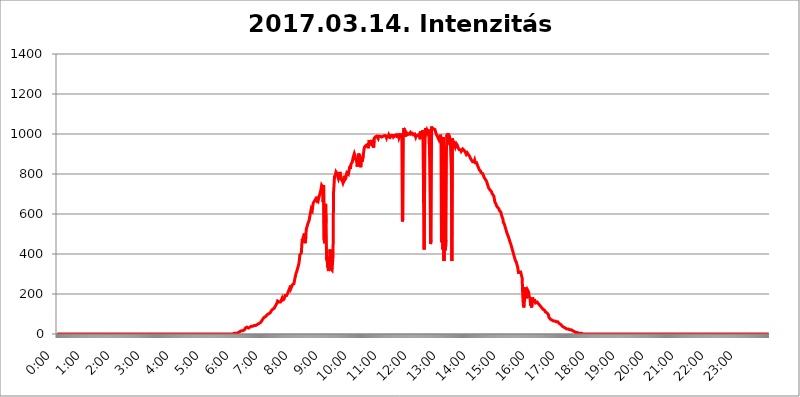
| Category | 2017.03.14. Intenzitás [W/m^2] |
|---|---|
| 0.0 | 0 |
| 0.0006944444444444445 | 0 |
| 0.001388888888888889 | 0 |
| 0.0020833333333333333 | 0 |
| 0.002777777777777778 | 0 |
| 0.003472222222222222 | 0 |
| 0.004166666666666667 | 0 |
| 0.004861111111111111 | 0 |
| 0.005555555555555556 | 0 |
| 0.0062499999999999995 | 0 |
| 0.006944444444444444 | 0 |
| 0.007638888888888889 | 0 |
| 0.008333333333333333 | 0 |
| 0.009027777777777779 | 0 |
| 0.009722222222222222 | 0 |
| 0.010416666666666666 | 0 |
| 0.011111111111111112 | 0 |
| 0.011805555555555555 | 0 |
| 0.012499999999999999 | 0 |
| 0.013194444444444444 | 0 |
| 0.013888888888888888 | 0 |
| 0.014583333333333332 | 0 |
| 0.015277777777777777 | 0 |
| 0.015972222222222224 | 0 |
| 0.016666666666666666 | 0 |
| 0.017361111111111112 | 0 |
| 0.018055555555555557 | 0 |
| 0.01875 | 0 |
| 0.019444444444444445 | 0 |
| 0.02013888888888889 | 0 |
| 0.020833333333333332 | 0 |
| 0.02152777777777778 | 0 |
| 0.022222222222222223 | 0 |
| 0.02291666666666667 | 0 |
| 0.02361111111111111 | 0 |
| 0.024305555555555556 | 0 |
| 0.024999999999999998 | 0 |
| 0.025694444444444447 | 0 |
| 0.02638888888888889 | 0 |
| 0.027083333333333334 | 0 |
| 0.027777777777777776 | 0 |
| 0.02847222222222222 | 0 |
| 0.029166666666666664 | 0 |
| 0.029861111111111113 | 0 |
| 0.030555555555555555 | 0 |
| 0.03125 | 0 |
| 0.03194444444444445 | 0 |
| 0.03263888888888889 | 0 |
| 0.03333333333333333 | 0 |
| 0.034027777777777775 | 0 |
| 0.034722222222222224 | 0 |
| 0.035416666666666666 | 0 |
| 0.036111111111111115 | 0 |
| 0.03680555555555556 | 0 |
| 0.0375 | 0 |
| 0.03819444444444444 | 0 |
| 0.03888888888888889 | 0 |
| 0.03958333333333333 | 0 |
| 0.04027777777777778 | 0 |
| 0.04097222222222222 | 0 |
| 0.041666666666666664 | 0 |
| 0.042361111111111106 | 0 |
| 0.04305555555555556 | 0 |
| 0.043750000000000004 | 0 |
| 0.044444444444444446 | 0 |
| 0.04513888888888889 | 0 |
| 0.04583333333333334 | 0 |
| 0.04652777777777778 | 0 |
| 0.04722222222222222 | 0 |
| 0.04791666666666666 | 0 |
| 0.04861111111111111 | 0 |
| 0.049305555555555554 | 0 |
| 0.049999999999999996 | 0 |
| 0.05069444444444445 | 0 |
| 0.051388888888888894 | 0 |
| 0.052083333333333336 | 0 |
| 0.05277777777777778 | 0 |
| 0.05347222222222222 | 0 |
| 0.05416666666666667 | 0 |
| 0.05486111111111111 | 0 |
| 0.05555555555555555 | 0 |
| 0.05625 | 0 |
| 0.05694444444444444 | 0 |
| 0.057638888888888885 | 0 |
| 0.05833333333333333 | 0 |
| 0.05902777777777778 | 0 |
| 0.059722222222222225 | 0 |
| 0.06041666666666667 | 0 |
| 0.061111111111111116 | 0 |
| 0.06180555555555556 | 0 |
| 0.0625 | 0 |
| 0.06319444444444444 | 0 |
| 0.06388888888888888 | 0 |
| 0.06458333333333334 | 0 |
| 0.06527777777777778 | 0 |
| 0.06597222222222222 | 0 |
| 0.06666666666666667 | 0 |
| 0.06736111111111111 | 0 |
| 0.06805555555555555 | 0 |
| 0.06874999999999999 | 0 |
| 0.06944444444444443 | 0 |
| 0.07013888888888889 | 0 |
| 0.07083333333333333 | 0 |
| 0.07152777777777779 | 0 |
| 0.07222222222222223 | 0 |
| 0.07291666666666667 | 0 |
| 0.07361111111111111 | 0 |
| 0.07430555555555556 | 0 |
| 0.075 | 0 |
| 0.07569444444444444 | 0 |
| 0.0763888888888889 | 0 |
| 0.07708333333333334 | 0 |
| 0.07777777777777778 | 0 |
| 0.07847222222222222 | 0 |
| 0.07916666666666666 | 0 |
| 0.0798611111111111 | 0 |
| 0.08055555555555556 | 0 |
| 0.08125 | 0 |
| 0.08194444444444444 | 0 |
| 0.08263888888888889 | 0 |
| 0.08333333333333333 | 0 |
| 0.08402777777777777 | 0 |
| 0.08472222222222221 | 0 |
| 0.08541666666666665 | 0 |
| 0.08611111111111112 | 0 |
| 0.08680555555555557 | 0 |
| 0.08750000000000001 | 0 |
| 0.08819444444444445 | 0 |
| 0.08888888888888889 | 0 |
| 0.08958333333333333 | 0 |
| 0.09027777777777778 | 0 |
| 0.09097222222222222 | 0 |
| 0.09166666666666667 | 0 |
| 0.09236111111111112 | 0 |
| 0.09305555555555556 | 0 |
| 0.09375 | 0 |
| 0.09444444444444444 | 0 |
| 0.09513888888888888 | 0 |
| 0.09583333333333333 | 0 |
| 0.09652777777777777 | 0 |
| 0.09722222222222222 | 0 |
| 0.09791666666666667 | 0 |
| 0.09861111111111111 | 0 |
| 0.09930555555555555 | 0 |
| 0.09999999999999999 | 0 |
| 0.10069444444444443 | 0 |
| 0.1013888888888889 | 0 |
| 0.10208333333333335 | 0 |
| 0.10277777777777779 | 0 |
| 0.10347222222222223 | 0 |
| 0.10416666666666667 | 0 |
| 0.10486111111111111 | 0 |
| 0.10555555555555556 | 0 |
| 0.10625 | 0 |
| 0.10694444444444444 | 0 |
| 0.1076388888888889 | 0 |
| 0.10833333333333334 | 0 |
| 0.10902777777777778 | 0 |
| 0.10972222222222222 | 0 |
| 0.1111111111111111 | 0 |
| 0.11180555555555556 | 0 |
| 0.11180555555555556 | 0 |
| 0.1125 | 0 |
| 0.11319444444444444 | 0 |
| 0.11388888888888889 | 0 |
| 0.11458333333333333 | 0 |
| 0.11527777777777777 | 0 |
| 0.11597222222222221 | 0 |
| 0.11666666666666665 | 0 |
| 0.1173611111111111 | 0 |
| 0.11805555555555557 | 0 |
| 0.11944444444444445 | 0 |
| 0.12013888888888889 | 0 |
| 0.12083333333333333 | 0 |
| 0.12152777777777778 | 0 |
| 0.12222222222222223 | 0 |
| 0.12291666666666667 | 0 |
| 0.12291666666666667 | 0 |
| 0.12361111111111112 | 0 |
| 0.12430555555555556 | 0 |
| 0.125 | 0 |
| 0.12569444444444444 | 0 |
| 0.12638888888888888 | 0 |
| 0.12708333333333333 | 0 |
| 0.16875 | 0 |
| 0.12847222222222224 | 0 |
| 0.12916666666666668 | 0 |
| 0.12986111111111112 | 0 |
| 0.13055555555555556 | 0 |
| 0.13125 | 0 |
| 0.13194444444444445 | 0 |
| 0.1326388888888889 | 0 |
| 0.13333333333333333 | 0 |
| 0.13402777777777777 | 0 |
| 0.13402777777777777 | 0 |
| 0.13472222222222222 | 0 |
| 0.13541666666666666 | 0 |
| 0.1361111111111111 | 0 |
| 0.13749999999999998 | 0 |
| 0.13819444444444443 | 0 |
| 0.1388888888888889 | 0 |
| 0.13958333333333334 | 0 |
| 0.14027777777777778 | 0 |
| 0.14097222222222222 | 0 |
| 0.14166666666666666 | 0 |
| 0.1423611111111111 | 0 |
| 0.14305555555555557 | 0 |
| 0.14375000000000002 | 0 |
| 0.14444444444444446 | 0 |
| 0.1451388888888889 | 0 |
| 0.1451388888888889 | 0 |
| 0.14652777777777778 | 0 |
| 0.14722222222222223 | 0 |
| 0.14791666666666667 | 0 |
| 0.1486111111111111 | 0 |
| 0.14930555555555555 | 0 |
| 0.15 | 0 |
| 0.15069444444444444 | 0 |
| 0.15138888888888888 | 0 |
| 0.15208333333333332 | 0 |
| 0.15277777777777776 | 0 |
| 0.15347222222222223 | 0 |
| 0.15416666666666667 | 0 |
| 0.15486111111111112 | 0 |
| 0.15555555555555556 | 0 |
| 0.15625 | 0 |
| 0.15694444444444444 | 0 |
| 0.15763888888888888 | 0 |
| 0.15833333333333333 | 0 |
| 0.15902777777777777 | 0 |
| 0.15972222222222224 | 0 |
| 0.16041666666666668 | 0 |
| 0.16111111111111112 | 0 |
| 0.16180555555555556 | 0 |
| 0.1625 | 0 |
| 0.16319444444444445 | 0 |
| 0.1638888888888889 | 0 |
| 0.16458333333333333 | 0 |
| 0.16527777777777777 | 0 |
| 0.16597222222222222 | 0 |
| 0.16666666666666666 | 0 |
| 0.1673611111111111 | 0 |
| 0.16805555555555554 | 0 |
| 0.16874999999999998 | 0 |
| 0.16944444444444443 | 0 |
| 0.17013888888888887 | 0 |
| 0.1708333333333333 | 0 |
| 0.17152777777777775 | 0 |
| 0.17222222222222225 | 0 |
| 0.1729166666666667 | 0 |
| 0.17361111111111113 | 0 |
| 0.17430555555555557 | 0 |
| 0.17500000000000002 | 0 |
| 0.17569444444444446 | 0 |
| 0.1763888888888889 | 0 |
| 0.17708333333333334 | 0 |
| 0.17777777777777778 | 0 |
| 0.17847222222222223 | 0 |
| 0.17916666666666667 | 0 |
| 0.1798611111111111 | 0 |
| 0.18055555555555555 | 0 |
| 0.18125 | 0 |
| 0.18194444444444444 | 0 |
| 0.1826388888888889 | 0 |
| 0.18333333333333335 | 0 |
| 0.1840277777777778 | 0 |
| 0.18472222222222223 | 0 |
| 0.18541666666666667 | 0 |
| 0.18611111111111112 | 0 |
| 0.18680555555555556 | 0 |
| 0.1875 | 0 |
| 0.18819444444444444 | 0 |
| 0.18888888888888888 | 0 |
| 0.18958333333333333 | 0 |
| 0.19027777777777777 | 0 |
| 0.1909722222222222 | 0 |
| 0.19166666666666665 | 0 |
| 0.19236111111111112 | 0 |
| 0.19305555555555554 | 0 |
| 0.19375 | 0 |
| 0.19444444444444445 | 0 |
| 0.1951388888888889 | 0 |
| 0.19583333333333333 | 0 |
| 0.19652777777777777 | 0 |
| 0.19722222222222222 | 0 |
| 0.19791666666666666 | 0 |
| 0.1986111111111111 | 0 |
| 0.19930555555555554 | 0 |
| 0.19999999999999998 | 0 |
| 0.20069444444444443 | 0 |
| 0.20138888888888887 | 0 |
| 0.2020833333333333 | 0 |
| 0.2027777777777778 | 0 |
| 0.2034722222222222 | 0 |
| 0.2041666666666667 | 0 |
| 0.20486111111111113 | 0 |
| 0.20555555555555557 | 0 |
| 0.20625000000000002 | 0 |
| 0.20694444444444446 | 0 |
| 0.2076388888888889 | 0 |
| 0.20833333333333334 | 0 |
| 0.20902777777777778 | 0 |
| 0.20972222222222223 | 0 |
| 0.21041666666666667 | 0 |
| 0.2111111111111111 | 0 |
| 0.21180555555555555 | 0 |
| 0.2125 | 0 |
| 0.21319444444444444 | 0 |
| 0.2138888888888889 | 0 |
| 0.21458333333333335 | 0 |
| 0.2152777777777778 | 0 |
| 0.21597222222222223 | 0 |
| 0.21666666666666667 | 0 |
| 0.21736111111111112 | 0 |
| 0.21805555555555556 | 0 |
| 0.21875 | 0 |
| 0.21944444444444444 | 0 |
| 0.22013888888888888 | 0 |
| 0.22083333333333333 | 0 |
| 0.22152777777777777 | 0 |
| 0.2222222222222222 | 0 |
| 0.22291666666666665 | 0 |
| 0.2236111111111111 | 0 |
| 0.22430555555555556 | 0 |
| 0.225 | 0 |
| 0.22569444444444445 | 0 |
| 0.2263888888888889 | 0 |
| 0.22708333333333333 | 0 |
| 0.22777777777777777 | 0 |
| 0.22847222222222222 | 0 |
| 0.22916666666666666 | 0 |
| 0.2298611111111111 | 0 |
| 0.23055555555555554 | 0 |
| 0.23124999999999998 | 0 |
| 0.23194444444444443 | 0 |
| 0.23263888888888887 | 0 |
| 0.2333333333333333 | 0 |
| 0.2340277777777778 | 0 |
| 0.2347222222222222 | 0 |
| 0.2354166666666667 | 0 |
| 0.23611111111111113 | 0 |
| 0.23680555555555557 | 0 |
| 0.23750000000000002 | 0 |
| 0.23819444444444446 | 0 |
| 0.2388888888888889 | 0 |
| 0.23958333333333334 | 0 |
| 0.24027777777777778 | 0 |
| 0.24097222222222223 | 0 |
| 0.24166666666666667 | 0 |
| 0.2423611111111111 | 0 |
| 0.24305555555555555 | 0 |
| 0.24375 | 0 |
| 0.24444444444444446 | 0 |
| 0.24513888888888888 | 0 |
| 0.24583333333333335 | 0 |
| 0.2465277777777778 | 0 |
| 0.24722222222222223 | 0 |
| 0.24791666666666667 | 3.525 |
| 0.24861111111111112 | 3.525 |
| 0.24930555555555556 | 3.525 |
| 0.25 | 3.525 |
| 0.25069444444444444 | 3.525 |
| 0.2513888888888889 | 3.525 |
| 0.2520833333333333 | 3.525 |
| 0.25277777777777777 | 3.525 |
| 0.2534722222222222 | 3.525 |
| 0.25416666666666665 | 7.887 |
| 0.2548611111111111 | 7.887 |
| 0.2555555555555556 | 7.887 |
| 0.25625000000000003 | 12.257 |
| 0.2569444444444445 | 12.257 |
| 0.2576388888888889 | 12.257 |
| 0.25833333333333336 | 16.636 |
| 0.2590277777777778 | 16.636 |
| 0.25972222222222224 | 16.636 |
| 0.2604166666666667 | 16.636 |
| 0.2611111111111111 | 21.024 |
| 0.26180555555555557 | 21.024 |
| 0.2625 | 21.024 |
| 0.26319444444444445 | 25.419 |
| 0.2638888888888889 | 29.823 |
| 0.26458333333333334 | 29.823 |
| 0.2652777777777778 | 29.823 |
| 0.2659722222222222 | 34.234 |
| 0.26666666666666666 | 29.823 |
| 0.2673611111111111 | 29.823 |
| 0.26805555555555555 | 29.823 |
| 0.26875 | 29.823 |
| 0.26944444444444443 | 29.823 |
| 0.2701388888888889 | 34.234 |
| 0.2708333333333333 | 34.234 |
| 0.27152777777777776 | 38.653 |
| 0.2722222222222222 | 38.653 |
| 0.27291666666666664 | 38.653 |
| 0.2736111111111111 | 38.653 |
| 0.2743055555555555 | 38.653 |
| 0.27499999999999997 | 43.079 |
| 0.27569444444444446 | 43.079 |
| 0.27638888888888885 | 43.079 |
| 0.27708333333333335 | 43.079 |
| 0.2777777777777778 | 43.079 |
| 0.27847222222222223 | 43.079 |
| 0.2791666666666667 | 43.079 |
| 0.2798611111111111 | 47.511 |
| 0.28055555555555556 | 47.511 |
| 0.28125 | 47.511 |
| 0.28194444444444444 | 47.511 |
| 0.2826388888888889 | 51.951 |
| 0.2833333333333333 | 51.951 |
| 0.28402777777777777 | 56.398 |
| 0.2847222222222222 | 56.398 |
| 0.28541666666666665 | 56.398 |
| 0.28611111111111115 | 60.85 |
| 0.28680555555555554 | 65.31 |
| 0.28750000000000003 | 65.31 |
| 0.2881944444444445 | 74.246 |
| 0.2888888888888889 | 74.246 |
| 0.28958333333333336 | 78.722 |
| 0.2902777777777778 | 83.205 |
| 0.29097222222222224 | 87.692 |
| 0.2916666666666667 | 87.692 |
| 0.2923611111111111 | 87.692 |
| 0.29305555555555557 | 92.184 |
| 0.29375 | 92.184 |
| 0.29444444444444445 | 96.682 |
| 0.2951388888888889 | 101.184 |
| 0.29583333333333334 | 101.184 |
| 0.2965277777777778 | 101.184 |
| 0.2972222222222222 | 101.184 |
| 0.29791666666666666 | 101.184 |
| 0.2986111111111111 | 105.69 |
| 0.29930555555555555 | 110.201 |
| 0.3 | 114.716 |
| 0.30069444444444443 | 114.716 |
| 0.3013888888888889 | 119.235 |
| 0.3020833333333333 | 123.758 |
| 0.30277777777777776 | 123.758 |
| 0.3034722222222222 | 128.284 |
| 0.30416666666666664 | 128.284 |
| 0.3048611111111111 | 132.814 |
| 0.3055555555555555 | 137.347 |
| 0.30624999999999997 | 141.884 |
| 0.3069444444444444 | 146.423 |
| 0.3076388888888889 | 150.964 |
| 0.30833333333333335 | 155.509 |
| 0.3090277777777778 | 164.605 |
| 0.30972222222222223 | 164.605 |
| 0.3104166666666667 | 160.056 |
| 0.3111111111111111 | 160.056 |
| 0.31180555555555556 | 160.056 |
| 0.3125 | 160.056 |
| 0.31319444444444444 | 160.056 |
| 0.3138888888888889 | 155.509 |
| 0.3145833333333333 | 164.605 |
| 0.31527777777777777 | 178.264 |
| 0.3159722222222222 | 169.156 |
| 0.31666666666666665 | 169.156 |
| 0.31736111111111115 | 173.709 |
| 0.31805555555555554 | 173.709 |
| 0.31875000000000003 | 182.82 |
| 0.3194444444444445 | 191.937 |
| 0.3201388888888889 | 187.378 |
| 0.32083333333333336 | 187.378 |
| 0.3215277777777778 | 191.937 |
| 0.32222222222222224 | 196.497 |
| 0.3229166666666667 | 201.058 |
| 0.3236111111111111 | 205.62 |
| 0.32430555555555557 | 214.746 |
| 0.325 | 219.309 |
| 0.32569444444444445 | 214.746 |
| 0.3263888888888889 | 233 |
| 0.32708333333333334 | 242.127 |
| 0.3277777777777778 | 228.436 |
| 0.3284722222222222 | 233 |
| 0.32916666666666666 | 233 |
| 0.3298611111111111 | 246.689 |
| 0.33055555555555555 | 251.251 |
| 0.33125 | 251.251 |
| 0.33194444444444443 | 251.251 |
| 0.3326388888888889 | 264.932 |
| 0.3333333333333333 | 278.603 |
| 0.3340277777777778 | 287.709 |
| 0.3347222222222222 | 301.354 |
| 0.3354166666666667 | 296.808 |
| 0.3361111111111111 | 314.98 |
| 0.3368055555555556 | 324.052 |
| 0.33749999999999997 | 333.113 |
| 0.33819444444444446 | 333.113 |
| 0.33888888888888885 | 351.198 |
| 0.33958333333333335 | 369.23 |
| 0.34027777777777773 | 396.164 |
| 0.34097222222222223 | 396.164 |
| 0.3416666666666666 | 396.164 |
| 0.3423611111111111 | 405.108 |
| 0.3430555555555555 | 449.551 |
| 0.34375 | 475.972 |
| 0.3444444444444445 | 458.38 |
| 0.3451388888888889 | 484.735 |
| 0.3458333333333334 | 480.356 |
| 0.34652777777777777 | 502.192 |
| 0.34722222222222227 | 462.786 |
| 0.34791666666666665 | 453.968 |
| 0.34861111111111115 | 489.108 |
| 0.34930555555555554 | 523.88 |
| 0.35000000000000003 | 532.513 |
| 0.3506944444444444 | 528.2 |
| 0.3513888888888889 | 549.704 |
| 0.3520833333333333 | 553.986 |
| 0.3527777777777778 | 549.704 |
| 0.3534722222222222 | 571.049 |
| 0.3541666666666667 | 575.299 |
| 0.3548611111111111 | 600.661 |
| 0.35555555555555557 | 613.252 |
| 0.35625 | 625.784 |
| 0.35694444444444445 | 629.948 |
| 0.3576388888888889 | 617.436 |
| 0.35833333333333334 | 638.256 |
| 0.3590277777777778 | 654.791 |
| 0.3597222222222222 | 654.791 |
| 0.36041666666666666 | 663.019 |
| 0.3611111111111111 | 667.123 |
| 0.36180555555555555 | 663.019 |
| 0.3625 | 675.311 |
| 0.36319444444444443 | 671.22 |
| 0.3638888888888889 | 667.123 |
| 0.3645833333333333 | 675.311 |
| 0.3652777777777778 | 679.395 |
| 0.3659722222222222 | 667.123 |
| 0.3666666666666667 | 679.395 |
| 0.3673611111111111 | 687.544 |
| 0.3680555555555556 | 687.544 |
| 0.36874999999999997 | 687.544 |
| 0.36944444444444446 | 715.858 |
| 0.37013888888888885 | 727.896 |
| 0.37083333333333335 | 743.859 |
| 0.37152777777777773 | 739.877 |
| 0.37222222222222223 | 735.89 |
| 0.3729166666666666 | 658.909 |
| 0.3736111111111111 | 743.859 |
| 0.3743055555555555 | 471.582 |
| 0.375 | 453.968 |
| 0.3756944444444445 | 558.261 |
| 0.3763888888888889 | 650.667 |
| 0.3770833333333334 | 553.986 |
| 0.37777777777777777 | 369.23 |
| 0.37847222222222227 | 387.202 |
| 0.37916666666666665 | 337.639 |
| 0.37986111111111115 | 328.584 |
| 0.38055555555555554 | 314.98 |
| 0.38125000000000003 | 319.517 |
| 0.3819444444444444 | 333.113 |
| 0.3826388888888889 | 422.943 |
| 0.3833333333333333 | 328.584 |
| 0.3840277777777778 | 324.052 |
| 0.3847222222222222 | 324.052 |
| 0.3854166666666667 | 319.517 |
| 0.3861111111111111 | 324.052 |
| 0.38680555555555557 | 391.685 |
| 0.3875 | 707.8 |
| 0.38819444444444445 | 743.859 |
| 0.3888888888888889 | 787.258 |
| 0.38958333333333334 | 783.342 |
| 0.3902777777777778 | 798.974 |
| 0.3909722222222222 | 810.641 |
| 0.39166666666666666 | 806.757 |
| 0.3923611111111111 | 802.868 |
| 0.39305555555555555 | 791.169 |
| 0.39375 | 787.258 |
| 0.39444444444444443 | 775.492 |
| 0.3951388888888889 | 783.342 |
| 0.3958333333333333 | 795.074 |
| 0.3965277777777778 | 810.641 |
| 0.3972222222222222 | 795.074 |
| 0.3979166666666667 | 783.342 |
| 0.3986111111111111 | 771.559 |
| 0.3993055555555556 | 771.559 |
| 0.39999999999999997 | 763.674 |
| 0.40069444444444446 | 755.766 |
| 0.40138888888888885 | 763.674 |
| 0.40208333333333335 | 771.559 |
| 0.40277777777777773 | 791.169 |
| 0.40347222222222223 | 771.559 |
| 0.4041666666666666 | 767.62 |
| 0.4048611111111111 | 779.42 |
| 0.4055555555555555 | 798.974 |
| 0.40625 | 806.757 |
| 0.4069444444444445 | 802.868 |
| 0.4076388888888889 | 806.757 |
| 0.4083333333333334 | 798.974 |
| 0.40902777777777777 | 810.641 |
| 0.40972222222222227 | 826.123 |
| 0.41041666666666665 | 837.682 |
| 0.41111111111111115 | 826.123 |
| 0.41180555555555554 | 845.365 |
| 0.41250000000000003 | 853.029 |
| 0.4131944444444444 | 849.199 |
| 0.4138888888888889 | 860.676 |
| 0.4145833333333333 | 875.918 |
| 0.4152777777777778 | 879.719 |
| 0.4159722222222222 | 894.885 |
| 0.4166666666666667 | 902.447 |
| 0.4173611111111111 | 894.885 |
| 0.41805555555555557 | 875.918 |
| 0.41875 | 875.918 |
| 0.41944444444444445 | 868.305 |
| 0.4201388888888889 | 879.719 |
| 0.42083333333333334 | 837.682 |
| 0.4215277777777778 | 879.719 |
| 0.4222222222222222 | 883.516 |
| 0.42291666666666666 | 902.447 |
| 0.4236111111111111 | 902.447 |
| 0.42430555555555555 | 883.516 |
| 0.425 | 856.855 |
| 0.42569444444444443 | 833.834 |
| 0.4263888888888889 | 875.918 |
| 0.4270833333333333 | 883.516 |
| 0.4277777777777778 | 860.676 |
| 0.4284722222222222 | 864.493 |
| 0.4291666666666667 | 894.885 |
| 0.4298611111111111 | 894.885 |
| 0.4305555555555556 | 928.819 |
| 0.43124999999999997 | 936.33 |
| 0.43194444444444446 | 940.082 |
| 0.43263888888888885 | 940.082 |
| 0.43333333333333335 | 943.832 |
| 0.43402777777777773 | 947.58 |
| 0.43472222222222223 | 947.58 |
| 0.4354166666666666 | 947.58 |
| 0.4361111111111111 | 928.819 |
| 0.4368055555555555 | 951.327 |
| 0.4375 | 970.034 |
| 0.4381944444444445 | 955.071 |
| 0.4388888888888889 | 955.071 |
| 0.4395833333333334 | 951.327 |
| 0.44027777777777777 | 947.58 |
| 0.44097222222222227 | 951.327 |
| 0.44166666666666665 | 958.814 |
| 0.44236111111111115 | 970.034 |
| 0.44305555555555554 | 970.034 |
| 0.44375000000000003 | 932.576 |
| 0.4444444444444444 | 977.508 |
| 0.4451388888888889 | 981.244 |
| 0.4458333333333333 | 984.98 |
| 0.4465277777777778 | 984.98 |
| 0.4472222222222222 | 988.714 |
| 0.4479166666666667 | 988.714 |
| 0.4486111111111111 | 992.448 |
| 0.44930555555555557 | 984.98 |
| 0.45 | 977.508 |
| 0.45069444444444445 | 988.714 |
| 0.4513888888888889 | 992.448 |
| 0.45208333333333334 | 992.448 |
| 0.4527777777777778 | 988.714 |
| 0.4534722222222222 | 992.448 |
| 0.45416666666666666 | 988.714 |
| 0.4548611111111111 | 984.98 |
| 0.45555555555555555 | 984.98 |
| 0.45625 | 988.714 |
| 0.45694444444444443 | 988.714 |
| 0.4576388888888889 | 988.714 |
| 0.4583333333333333 | 992.448 |
| 0.4590277777777778 | 992.448 |
| 0.4597222222222222 | 992.448 |
| 0.4604166666666667 | 992.448 |
| 0.4611111111111111 | 988.714 |
| 0.4618055555555556 | 981.244 |
| 0.46249999999999997 | 988.714 |
| 0.46319444444444446 | 988.714 |
| 0.46388888888888885 | 988.714 |
| 0.46458333333333335 | 984.98 |
| 0.46527777777777773 | 996.182 |
| 0.46597222222222223 | 996.182 |
| 0.4666666666666666 | 992.448 |
| 0.4673611111111111 | 984.98 |
| 0.4680555555555555 | 988.714 |
| 0.46875 | 992.448 |
| 0.4694444444444445 | 996.182 |
| 0.4701388888888889 | 988.714 |
| 0.4708333333333334 | 992.448 |
| 0.47152777777777777 | 984.98 |
| 0.47222222222222227 | 988.714 |
| 0.47291666666666665 | 988.714 |
| 0.47361111111111115 | 992.448 |
| 0.47430555555555554 | 996.182 |
| 0.47500000000000003 | 996.182 |
| 0.4756944444444444 | 996.182 |
| 0.4763888888888889 | 988.714 |
| 0.4770833333333333 | 992.448 |
| 0.4777777777777778 | 988.714 |
| 0.4784722222222222 | 992.448 |
| 0.4791666666666667 | 981.244 |
| 0.4798611111111111 | 988.714 |
| 0.48055555555555557 | 1003.65 |
| 0.48125 | 1007.383 |
| 0.48194444444444445 | 984.98 |
| 0.4826388888888889 | 999.916 |
| 0.48333333333333334 | 977.508 |
| 0.4840277777777778 | 562.53 |
| 0.4847222222222222 | 575.299 |
| 0.48541666666666666 | 999.916 |
| 0.4861111111111111 | 1029.798 |
| 0.48680555555555555 | 1014.852 |
| 0.4875 | 984.98 |
| 0.48819444444444443 | 1014.852 |
| 0.4888888888888889 | 1011.118 |
| 0.4895833333333333 | 1007.383 |
| 0.4902777777777778 | 1003.65 |
| 0.4909722222222222 | 996.182 |
| 0.4916666666666667 | 999.916 |
| 0.4923611111111111 | 999.916 |
| 0.4930555555555556 | 999.916 |
| 0.49374999999999997 | 999.916 |
| 0.49444444444444446 | 999.916 |
| 0.49513888888888885 | 1007.383 |
| 0.49583333333333335 | 999.916 |
| 0.49652777777777773 | 999.916 |
| 0.49722222222222223 | 996.182 |
| 0.4979166666666666 | 1003.65 |
| 0.4986111111111111 | 999.916 |
| 0.4993055555555555 | 996.182 |
| 0.5 | 999.916 |
| 0.5006944444444444 | 999.916 |
| 0.5013888888888889 | 999.916 |
| 0.5020833333333333 | 996.182 |
| 0.5027777777777778 | 984.98 |
| 0.5034722222222222 | 992.448 |
| 0.5041666666666667 | 992.448 |
| 0.5048611111111111 | 992.448 |
| 0.5055555555555555 | 992.448 |
| 0.50625 | 988.714 |
| 0.5069444444444444 | 992.448 |
| 0.5076388888888889 | 999.916 |
| 0.5083333333333333 | 1003.65 |
| 0.5090277777777777 | 973.772 |
| 0.5097222222222222 | 1014.852 |
| 0.5104166666666666 | 1007.383 |
| 0.5111111111111112 | 1011.118 |
| 0.5118055555555555 | 1003.65 |
| 0.5125000000000001 | 1011.118 |
| 0.5131944444444444 | 1018.587 |
| 0.513888888888889 | 654.791 |
| 0.5145833333333333 | 422.943 |
| 0.5152777777777778 | 791.169 |
| 0.5159722222222222 | 1014.852 |
| 0.5166666666666667 | 1029.798 |
| 0.517361111111111 | 1014.852 |
| 0.5180555555555556 | 1007.383 |
| 0.5187499999999999 | 1018.587 |
| 0.5194444444444445 | 1022.323 |
| 0.5201388888888888 | 1007.383 |
| 0.5208333333333334 | 1011.118 |
| 0.5215277777777778 | 1022.323 |
| 0.5222222222222223 | 891.099 |
| 0.5229166666666667 | 699.717 |
| 0.5236111111111111 | 449.551 |
| 0.5243055555555556 | 471.582 |
| 0.525 | 1037.277 |
| 0.5256944444444445 | 1022.323 |
| 0.5263888888888889 | 1018.587 |
| 0.5270833333333333 | 1022.323 |
| 0.5277777777777778 | 1026.06 |
| 0.5284722222222222 | 1022.323 |
| 0.5291666666666667 | 1022.323 |
| 0.5298611111111111 | 1022.323 |
| 0.5305555555555556 | 1011.118 |
| 0.53125 | 1007.383 |
| 0.5319444444444444 | 996.182 |
| 0.5326388888888889 | 992.448 |
| 0.5333333333333333 | 992.448 |
| 0.5340277777777778 | 981.244 |
| 0.5347222222222222 | 981.244 |
| 0.5354166666666667 | 970.034 |
| 0.5361111111111111 | 977.508 |
| 0.5368055555555555 | 988.714 |
| 0.5375 | 996.182 |
| 0.5381944444444444 | 981.244 |
| 0.5388888888888889 | 458.38 |
| 0.5395833333333333 | 528.2 |
| 0.5402777777777777 | 571.049 |
| 0.5409722222222222 | 422.943 |
| 0.5416666666666666 | 984.98 |
| 0.5423611111111112 | 364.728 |
| 0.5430555555555555 | 369.23 |
| 0.5437500000000001 | 658.909 |
| 0.5444444444444444 | 418.492 |
| 0.545138888888889 | 471.582 |
| 0.5458333333333333 | 913.766 |
| 0.5465277777777778 | 996.182 |
| 0.5472222222222222 | 966.295 |
| 0.5479166666666667 | 1003.65 |
| 0.548611111111111 | 981.244 |
| 0.5493055555555556 | 966.295 |
| 0.5499999999999999 | 962.555 |
| 0.5506944444444445 | 977.508 |
| 0.5513888888888888 | 966.295 |
| 0.5520833333333334 | 966.295 |
| 0.5527777777777778 | 802.868 |
| 0.5534722222222223 | 364.728 |
| 0.5541666666666667 | 977.508 |
| 0.5548611111111111 | 966.295 |
| 0.5555555555555556 | 962.555 |
| 0.55625 | 962.555 |
| 0.5569444444444445 | 955.071 |
| 0.5576388888888889 | 958.814 |
| 0.5583333333333333 | 936.33 |
| 0.5590277777777778 | 932.576 |
| 0.5597222222222222 | 951.327 |
| 0.5604166666666667 | 951.327 |
| 0.5611111111111111 | 943.832 |
| 0.5618055555555556 | 936.33 |
| 0.5625 | 928.819 |
| 0.5631944444444444 | 928.819 |
| 0.5638888888888889 | 921.298 |
| 0.5645833333333333 | 921.298 |
| 0.5652777777777778 | 925.06 |
| 0.5659722222222222 | 921.298 |
| 0.5666666666666667 | 913.766 |
| 0.5673611111111111 | 909.996 |
| 0.5680555555555555 | 913.766 |
| 0.56875 | 925.06 |
| 0.5694444444444444 | 925.06 |
| 0.5701388888888889 | 925.06 |
| 0.5708333333333333 | 917.534 |
| 0.5715277777777777 | 917.534 |
| 0.5722222222222222 | 909.996 |
| 0.5729166666666666 | 909.996 |
| 0.5736111111111112 | 898.668 |
| 0.5743055555555555 | 902.447 |
| 0.5750000000000001 | 906.223 |
| 0.5756944444444444 | 909.996 |
| 0.576388888888889 | 898.668 |
| 0.5770833333333333 | 894.885 |
| 0.5777777777777778 | 894.885 |
| 0.5784722222222222 | 887.309 |
| 0.5791666666666667 | 883.516 |
| 0.579861111111111 | 875.918 |
| 0.5805555555555556 | 872.114 |
| 0.5812499999999999 | 868.305 |
| 0.5819444444444445 | 864.493 |
| 0.5826388888888888 | 860.676 |
| 0.5833333333333334 | 856.855 |
| 0.5840277777777778 | 856.855 |
| 0.5847222222222223 | 860.676 |
| 0.5854166666666667 | 868.305 |
| 0.5861111111111111 | 856.855 |
| 0.5868055555555556 | 856.855 |
| 0.5875 | 853.029 |
| 0.5881944444444445 | 856.855 |
| 0.5888888888888889 | 849.199 |
| 0.5895833333333333 | 841.526 |
| 0.5902777777777778 | 837.682 |
| 0.5909722222222222 | 829.981 |
| 0.5916666666666667 | 822.26 |
| 0.5923611111111111 | 822.26 |
| 0.5930555555555556 | 818.392 |
| 0.59375 | 814.519 |
| 0.5944444444444444 | 806.757 |
| 0.5951388888888889 | 802.868 |
| 0.5958333333333333 | 806.757 |
| 0.5965277777777778 | 802.868 |
| 0.5972222222222222 | 802.868 |
| 0.5979166666666667 | 791.169 |
| 0.5986111111111111 | 783.342 |
| 0.5993055555555555 | 783.342 |
| 0.6 | 779.42 |
| 0.6006944444444444 | 771.559 |
| 0.6013888888888889 | 767.62 |
| 0.6020833333333333 | 763.674 |
| 0.6027777777777777 | 755.766 |
| 0.6034722222222222 | 747.834 |
| 0.6041666666666666 | 743.859 |
| 0.6048611111111112 | 731.896 |
| 0.6055555555555555 | 735.89 |
| 0.6062500000000001 | 727.896 |
| 0.6069444444444444 | 719.877 |
| 0.607638888888889 | 715.858 |
| 0.6083333333333333 | 715.858 |
| 0.6090277777777778 | 711.832 |
| 0.6097222222222222 | 703.762 |
| 0.6104166666666667 | 703.762 |
| 0.611111111111111 | 695.666 |
| 0.6118055555555556 | 691.608 |
| 0.6124999999999999 | 687.544 |
| 0.6131944444444445 | 671.22 |
| 0.6138888888888888 | 658.909 |
| 0.6145833333333334 | 658.909 |
| 0.6152777777777778 | 650.667 |
| 0.6159722222222223 | 642.4 |
| 0.6166666666666667 | 638.256 |
| 0.6173611111111111 | 634.105 |
| 0.6180555555555556 | 629.948 |
| 0.61875 | 629.948 |
| 0.6194444444444445 | 625.784 |
| 0.6201388888888889 | 617.436 |
| 0.6208333333333333 | 621.613 |
| 0.6215277777777778 | 617.436 |
| 0.6222222222222222 | 609.062 |
| 0.6229166666666667 | 596.45 |
| 0.6236111111111111 | 588.009 |
| 0.6243055555555556 | 583.779 |
| 0.625 | 575.299 |
| 0.6256944444444444 | 558.261 |
| 0.6263888888888889 | 553.986 |
| 0.6270833333333333 | 549.704 |
| 0.6277777777777778 | 541.121 |
| 0.6284722222222222 | 532.513 |
| 0.6291666666666667 | 523.88 |
| 0.6298611111111111 | 519.555 |
| 0.6305555555555555 | 506.542 |
| 0.63125 | 502.192 |
| 0.6319444444444444 | 493.475 |
| 0.6326388888888889 | 489.108 |
| 0.6333333333333333 | 480.356 |
| 0.6340277777777777 | 475.972 |
| 0.6347222222222222 | 462.786 |
| 0.6354166666666666 | 458.38 |
| 0.6361111111111112 | 449.551 |
| 0.6368055555555555 | 440.702 |
| 0.6375000000000001 | 436.27 |
| 0.6381944444444444 | 422.943 |
| 0.638888888888889 | 414.035 |
| 0.6395833333333333 | 405.108 |
| 0.6402777777777778 | 396.164 |
| 0.6409722222222222 | 387.202 |
| 0.6416666666666667 | 378.224 |
| 0.642361111111111 | 369.23 |
| 0.6430555555555556 | 364.728 |
| 0.6437499999999999 | 360.221 |
| 0.6444444444444445 | 351.198 |
| 0.6451388888888888 | 342.162 |
| 0.6458333333333334 | 333.113 |
| 0.6465277777777778 | 314.98 |
| 0.6472222222222223 | 301.354 |
| 0.6479166666666667 | 310.44 |
| 0.6486111111111111 | 314.98 |
| 0.6493055555555556 | 310.44 |
| 0.65 | 310.44 |
| 0.6506944444444445 | 305.898 |
| 0.6513888888888889 | 287.709 |
| 0.6520833333333333 | 278.603 |
| 0.6527777777777778 | 201.058 |
| 0.6534722222222222 | 155.509 |
| 0.6541666666666667 | 132.814 |
| 0.6548611111111111 | 141.884 |
| 0.6555555555555556 | 187.378 |
| 0.65625 | 233 |
| 0.6569444444444444 | 219.309 |
| 0.6576388888888889 | 178.264 |
| 0.6583333333333333 | 187.378 |
| 0.6590277777777778 | 201.058 |
| 0.6597222222222222 | 219.309 |
| 0.6604166666666667 | 214.746 |
| 0.6611111111111111 | 210.182 |
| 0.6618055555555555 | 191.937 |
| 0.6625 | 191.937 |
| 0.6631944444444444 | 173.709 |
| 0.6638888888888889 | 141.884 |
| 0.6645833333333333 | 160.056 |
| 0.6652777777777777 | 132.814 |
| 0.6659722222222222 | 150.964 |
| 0.6666666666666666 | 182.82 |
| 0.6673611111111111 | 187.378 |
| 0.6680555555555556 | 155.509 |
| 0.6687500000000001 | 173.709 |
| 0.6694444444444444 | 173.709 |
| 0.6701388888888888 | 169.156 |
| 0.6708333333333334 | 155.509 |
| 0.6715277777777778 | 155.509 |
| 0.6722222222222222 | 155.509 |
| 0.6729166666666666 | 160.056 |
| 0.6736111111111112 | 155.509 |
| 0.6743055555555556 | 155.509 |
| 0.6749999999999999 | 150.964 |
| 0.6756944444444444 | 146.423 |
| 0.6763888888888889 | 146.423 |
| 0.6770833333333334 | 141.884 |
| 0.6777777777777777 | 137.347 |
| 0.6784722222222223 | 137.347 |
| 0.6791666666666667 | 132.814 |
| 0.6798611111111111 | 132.814 |
| 0.6805555555555555 | 128.284 |
| 0.68125 | 123.758 |
| 0.6819444444444445 | 119.235 |
| 0.6826388888888889 | 119.235 |
| 0.6833333333333332 | 119.235 |
| 0.6840277777777778 | 114.716 |
| 0.6847222222222222 | 110.201 |
| 0.6854166666666667 | 110.201 |
| 0.686111111111111 | 105.69 |
| 0.6868055555555556 | 105.69 |
| 0.6875 | 101.184 |
| 0.6881944444444444 | 101.184 |
| 0.688888888888889 | 96.682 |
| 0.6895833333333333 | 83.205 |
| 0.6902777777777778 | 78.722 |
| 0.6909722222222222 | 78.722 |
| 0.6916666666666668 | 74.246 |
| 0.6923611111111111 | 74.246 |
| 0.6930555555555555 | 74.246 |
| 0.69375 | 69.775 |
| 0.6944444444444445 | 69.775 |
| 0.6951388888888889 | 65.31 |
| 0.6958333333333333 | 65.31 |
| 0.6965277777777777 | 60.85 |
| 0.6972222222222223 | 60.85 |
| 0.6979166666666666 | 65.31 |
| 0.6986111111111111 | 65.31 |
| 0.6993055555555556 | 60.85 |
| 0.7000000000000001 | 60.85 |
| 0.7006944444444444 | 60.85 |
| 0.7013888888888888 | 60.85 |
| 0.7020833333333334 | 60.85 |
| 0.7027777777777778 | 56.398 |
| 0.7034722222222222 | 56.398 |
| 0.7041666666666666 | 51.951 |
| 0.7048611111111112 | 51.951 |
| 0.7055555555555556 | 47.511 |
| 0.7062499999999999 | 47.511 |
| 0.7069444444444444 | 47.511 |
| 0.7076388888888889 | 43.079 |
| 0.7083333333333334 | 38.653 |
| 0.7090277777777777 | 38.653 |
| 0.7097222222222223 | 34.234 |
| 0.7104166666666667 | 34.234 |
| 0.7111111111111111 | 29.823 |
| 0.7118055555555555 | 29.823 |
| 0.7125 | 29.823 |
| 0.7131944444444445 | 25.419 |
| 0.7138888888888889 | 25.419 |
| 0.7145833333333332 | 25.419 |
| 0.7152777777777778 | 25.419 |
| 0.7159722222222222 | 25.419 |
| 0.7166666666666667 | 25.419 |
| 0.717361111111111 | 25.419 |
| 0.7180555555555556 | 21.024 |
| 0.71875 | 21.024 |
| 0.7194444444444444 | 21.024 |
| 0.720138888888889 | 21.024 |
| 0.7208333333333333 | 21.024 |
| 0.7215277777777778 | 16.636 |
| 0.7222222222222222 | 16.636 |
| 0.7229166666666668 | 16.636 |
| 0.7236111111111111 | 12.257 |
| 0.7243055555555555 | 12.257 |
| 0.725 | 12.257 |
| 0.7256944444444445 | 12.257 |
| 0.7263888888888889 | 12.257 |
| 0.7270833333333333 | 7.887 |
| 0.7277777777777777 | 7.887 |
| 0.7284722222222223 | 7.887 |
| 0.7291666666666666 | 7.887 |
| 0.7298611111111111 | 3.525 |
| 0.7305555555555556 | 3.525 |
| 0.7312500000000001 | 3.525 |
| 0.7319444444444444 | 3.525 |
| 0.7326388888888888 | 3.525 |
| 0.7333333333333334 | 3.525 |
| 0.7340277777777778 | 3.525 |
| 0.7347222222222222 | 3.525 |
| 0.7354166666666666 | 3.525 |
| 0.7361111111111112 | 3.525 |
| 0.7368055555555556 | 0 |
| 0.7374999999999999 | 0 |
| 0.7381944444444444 | 0 |
| 0.7388888888888889 | 0 |
| 0.7395833333333334 | 0 |
| 0.7402777777777777 | 0 |
| 0.7409722222222223 | 0 |
| 0.7416666666666667 | 0 |
| 0.7423611111111111 | 0 |
| 0.7430555555555555 | 0 |
| 0.74375 | 0 |
| 0.7444444444444445 | 0 |
| 0.7451388888888889 | 0 |
| 0.7458333333333332 | 0 |
| 0.7465277777777778 | 0 |
| 0.7472222222222222 | 0 |
| 0.7479166666666667 | 0 |
| 0.748611111111111 | 0 |
| 0.7493055555555556 | 0 |
| 0.75 | 0 |
| 0.7506944444444444 | 0 |
| 0.751388888888889 | 0 |
| 0.7520833333333333 | 0 |
| 0.7527777777777778 | 0 |
| 0.7534722222222222 | 0 |
| 0.7541666666666668 | 0 |
| 0.7548611111111111 | 0 |
| 0.7555555555555555 | 0 |
| 0.75625 | 0 |
| 0.7569444444444445 | 0 |
| 0.7576388888888889 | 0 |
| 0.7583333333333333 | 0 |
| 0.7590277777777777 | 0 |
| 0.7597222222222223 | 0 |
| 0.7604166666666666 | 0 |
| 0.7611111111111111 | 0 |
| 0.7618055555555556 | 0 |
| 0.7625000000000001 | 0 |
| 0.7631944444444444 | 0 |
| 0.7638888888888888 | 0 |
| 0.7645833333333334 | 0 |
| 0.7652777777777778 | 0 |
| 0.7659722222222222 | 0 |
| 0.7666666666666666 | 0 |
| 0.7673611111111112 | 0 |
| 0.7680555555555556 | 0 |
| 0.7687499999999999 | 0 |
| 0.7694444444444444 | 0 |
| 0.7701388888888889 | 0 |
| 0.7708333333333334 | 0 |
| 0.7715277777777777 | 0 |
| 0.7722222222222223 | 0 |
| 0.7729166666666667 | 0 |
| 0.7736111111111111 | 0 |
| 0.7743055555555555 | 0 |
| 0.775 | 0 |
| 0.7756944444444445 | 0 |
| 0.7763888888888889 | 0 |
| 0.7770833333333332 | 0 |
| 0.7777777777777778 | 0 |
| 0.7784722222222222 | 0 |
| 0.7791666666666667 | 0 |
| 0.779861111111111 | 0 |
| 0.7805555555555556 | 0 |
| 0.78125 | 0 |
| 0.7819444444444444 | 0 |
| 0.782638888888889 | 0 |
| 0.7833333333333333 | 0 |
| 0.7840277777777778 | 0 |
| 0.7847222222222222 | 0 |
| 0.7854166666666668 | 0 |
| 0.7861111111111111 | 0 |
| 0.7868055555555555 | 0 |
| 0.7875 | 0 |
| 0.7881944444444445 | 0 |
| 0.7888888888888889 | 0 |
| 0.7895833333333333 | 0 |
| 0.7902777777777777 | 0 |
| 0.7909722222222223 | 0 |
| 0.7916666666666666 | 0 |
| 0.7923611111111111 | 0 |
| 0.7930555555555556 | 0 |
| 0.7937500000000001 | 0 |
| 0.7944444444444444 | 0 |
| 0.7951388888888888 | 0 |
| 0.7958333333333334 | 0 |
| 0.7965277777777778 | 0 |
| 0.7972222222222222 | 0 |
| 0.7979166666666666 | 0 |
| 0.7986111111111112 | 0 |
| 0.7993055555555556 | 0 |
| 0.7999999999999999 | 0 |
| 0.8006944444444444 | 0 |
| 0.8013888888888889 | 0 |
| 0.8020833333333334 | 0 |
| 0.8027777777777777 | 0 |
| 0.8034722222222223 | 0 |
| 0.8041666666666667 | 0 |
| 0.8048611111111111 | 0 |
| 0.8055555555555555 | 0 |
| 0.80625 | 0 |
| 0.8069444444444445 | 0 |
| 0.8076388888888889 | 0 |
| 0.8083333333333332 | 0 |
| 0.8090277777777778 | 0 |
| 0.8097222222222222 | 0 |
| 0.8104166666666667 | 0 |
| 0.811111111111111 | 0 |
| 0.8118055555555556 | 0 |
| 0.8125 | 0 |
| 0.8131944444444444 | 0 |
| 0.813888888888889 | 0 |
| 0.8145833333333333 | 0 |
| 0.8152777777777778 | 0 |
| 0.8159722222222222 | 0 |
| 0.8166666666666668 | 0 |
| 0.8173611111111111 | 0 |
| 0.8180555555555555 | 0 |
| 0.81875 | 0 |
| 0.8194444444444445 | 0 |
| 0.8201388888888889 | 0 |
| 0.8208333333333333 | 0 |
| 0.8215277777777777 | 0 |
| 0.8222222222222223 | 0 |
| 0.8229166666666666 | 0 |
| 0.8236111111111111 | 0 |
| 0.8243055555555556 | 0 |
| 0.8250000000000001 | 0 |
| 0.8256944444444444 | 0 |
| 0.8263888888888888 | 0 |
| 0.8270833333333334 | 0 |
| 0.8277777777777778 | 0 |
| 0.8284722222222222 | 0 |
| 0.8291666666666666 | 0 |
| 0.8298611111111112 | 0 |
| 0.8305555555555556 | 0 |
| 0.8312499999999999 | 0 |
| 0.8319444444444444 | 0 |
| 0.8326388888888889 | 0 |
| 0.8333333333333334 | 0 |
| 0.8340277777777777 | 0 |
| 0.8347222222222223 | 0 |
| 0.8354166666666667 | 0 |
| 0.8361111111111111 | 0 |
| 0.8368055555555555 | 0 |
| 0.8375 | 0 |
| 0.8381944444444445 | 0 |
| 0.8388888888888889 | 0 |
| 0.8395833333333332 | 0 |
| 0.8402777777777778 | 0 |
| 0.8409722222222222 | 0 |
| 0.8416666666666667 | 0 |
| 0.842361111111111 | 0 |
| 0.8430555555555556 | 0 |
| 0.84375 | 0 |
| 0.8444444444444444 | 0 |
| 0.845138888888889 | 0 |
| 0.8458333333333333 | 0 |
| 0.8465277777777778 | 0 |
| 0.8472222222222222 | 0 |
| 0.8479166666666668 | 0 |
| 0.8486111111111111 | 0 |
| 0.8493055555555555 | 0 |
| 0.85 | 0 |
| 0.8506944444444445 | 0 |
| 0.8513888888888889 | 0 |
| 0.8520833333333333 | 0 |
| 0.8527777777777777 | 0 |
| 0.8534722222222223 | 0 |
| 0.8541666666666666 | 0 |
| 0.8548611111111111 | 0 |
| 0.8555555555555556 | 0 |
| 0.8562500000000001 | 0 |
| 0.8569444444444444 | 0 |
| 0.8576388888888888 | 0 |
| 0.8583333333333334 | 0 |
| 0.8590277777777778 | 0 |
| 0.8597222222222222 | 0 |
| 0.8604166666666666 | 0 |
| 0.8611111111111112 | 0 |
| 0.8618055555555556 | 0 |
| 0.8624999999999999 | 0 |
| 0.8631944444444444 | 0 |
| 0.8638888888888889 | 0 |
| 0.8645833333333334 | 0 |
| 0.8652777777777777 | 0 |
| 0.8659722222222223 | 0 |
| 0.8666666666666667 | 0 |
| 0.8673611111111111 | 0 |
| 0.8680555555555555 | 0 |
| 0.86875 | 0 |
| 0.8694444444444445 | 0 |
| 0.8701388888888889 | 0 |
| 0.8708333333333332 | 0 |
| 0.8715277777777778 | 0 |
| 0.8722222222222222 | 0 |
| 0.8729166666666667 | 0 |
| 0.873611111111111 | 0 |
| 0.8743055555555556 | 0 |
| 0.875 | 0 |
| 0.8756944444444444 | 0 |
| 0.876388888888889 | 0 |
| 0.8770833333333333 | 0 |
| 0.8777777777777778 | 0 |
| 0.8784722222222222 | 0 |
| 0.8791666666666668 | 0 |
| 0.8798611111111111 | 0 |
| 0.8805555555555555 | 0 |
| 0.88125 | 0 |
| 0.8819444444444445 | 0 |
| 0.8826388888888889 | 0 |
| 0.8833333333333333 | 0 |
| 0.8840277777777777 | 0 |
| 0.8847222222222223 | 0 |
| 0.8854166666666666 | 0 |
| 0.8861111111111111 | 0 |
| 0.8868055555555556 | 0 |
| 0.8875000000000001 | 0 |
| 0.8881944444444444 | 0 |
| 0.8888888888888888 | 0 |
| 0.8895833333333334 | 0 |
| 0.8902777777777778 | 0 |
| 0.8909722222222222 | 0 |
| 0.8916666666666666 | 0 |
| 0.8923611111111112 | 0 |
| 0.8930555555555556 | 0 |
| 0.8937499999999999 | 0 |
| 0.8944444444444444 | 0 |
| 0.8951388888888889 | 0 |
| 0.8958333333333334 | 0 |
| 0.8965277777777777 | 0 |
| 0.8972222222222223 | 0 |
| 0.8979166666666667 | 0 |
| 0.8986111111111111 | 0 |
| 0.8993055555555555 | 0 |
| 0.9 | 0 |
| 0.9006944444444445 | 0 |
| 0.9013888888888889 | 0 |
| 0.9020833333333332 | 0 |
| 0.9027777777777778 | 0 |
| 0.9034722222222222 | 0 |
| 0.9041666666666667 | 0 |
| 0.904861111111111 | 0 |
| 0.9055555555555556 | 0 |
| 0.90625 | 0 |
| 0.9069444444444444 | 0 |
| 0.907638888888889 | 0 |
| 0.9083333333333333 | 0 |
| 0.9090277777777778 | 0 |
| 0.9097222222222222 | 0 |
| 0.9104166666666668 | 0 |
| 0.9111111111111111 | 0 |
| 0.9118055555555555 | 0 |
| 0.9125 | 0 |
| 0.9131944444444445 | 0 |
| 0.9138888888888889 | 0 |
| 0.9145833333333333 | 0 |
| 0.9152777777777777 | 0 |
| 0.9159722222222223 | 0 |
| 0.9166666666666666 | 0 |
| 0.9173611111111111 | 0 |
| 0.9180555555555556 | 0 |
| 0.9187500000000001 | 0 |
| 0.9194444444444444 | 0 |
| 0.9201388888888888 | 0 |
| 0.9208333333333334 | 0 |
| 0.9215277777777778 | 0 |
| 0.9222222222222222 | 0 |
| 0.9229166666666666 | 0 |
| 0.9236111111111112 | 0 |
| 0.9243055555555556 | 0 |
| 0.9249999999999999 | 0 |
| 0.9256944444444444 | 0 |
| 0.9263888888888889 | 0 |
| 0.9270833333333334 | 0 |
| 0.9277777777777777 | 0 |
| 0.9284722222222223 | 0 |
| 0.9291666666666667 | 0 |
| 0.9298611111111111 | 0 |
| 0.9305555555555555 | 0 |
| 0.93125 | 0 |
| 0.9319444444444445 | 0 |
| 0.9326388888888889 | 0 |
| 0.9333333333333332 | 0 |
| 0.9340277777777778 | 0 |
| 0.9347222222222222 | 0 |
| 0.9354166666666667 | 0 |
| 0.936111111111111 | 0 |
| 0.9368055555555556 | 0 |
| 0.9375 | 0 |
| 0.9381944444444444 | 0 |
| 0.938888888888889 | 0 |
| 0.9395833333333333 | 0 |
| 0.9402777777777778 | 0 |
| 0.9409722222222222 | 0 |
| 0.9416666666666668 | 0 |
| 0.9423611111111111 | 0 |
| 0.9430555555555555 | 0 |
| 0.94375 | 0 |
| 0.9444444444444445 | 0 |
| 0.9451388888888889 | 0 |
| 0.9458333333333333 | 0 |
| 0.9465277777777777 | 0 |
| 0.9472222222222223 | 0 |
| 0.9479166666666666 | 0 |
| 0.9486111111111111 | 0 |
| 0.9493055555555556 | 0 |
| 0.9500000000000001 | 0 |
| 0.9506944444444444 | 0 |
| 0.9513888888888888 | 0 |
| 0.9520833333333334 | 0 |
| 0.9527777777777778 | 0 |
| 0.9534722222222222 | 0 |
| 0.9541666666666666 | 0 |
| 0.9548611111111112 | 0 |
| 0.9555555555555556 | 0 |
| 0.9562499999999999 | 0 |
| 0.9569444444444444 | 0 |
| 0.9576388888888889 | 0 |
| 0.9583333333333334 | 0 |
| 0.9590277777777777 | 0 |
| 0.9597222222222223 | 0 |
| 0.9604166666666667 | 0 |
| 0.9611111111111111 | 0 |
| 0.9618055555555555 | 0 |
| 0.9625 | 0 |
| 0.9631944444444445 | 0 |
| 0.9638888888888889 | 0 |
| 0.9645833333333332 | 0 |
| 0.9652777777777778 | 0 |
| 0.9659722222222222 | 0 |
| 0.9666666666666667 | 0 |
| 0.967361111111111 | 0 |
| 0.9680555555555556 | 0 |
| 0.96875 | 0 |
| 0.9694444444444444 | 0 |
| 0.970138888888889 | 0 |
| 0.9708333333333333 | 0 |
| 0.9715277777777778 | 0 |
| 0.9722222222222222 | 0 |
| 0.9729166666666668 | 0 |
| 0.9736111111111111 | 0 |
| 0.9743055555555555 | 0 |
| 0.975 | 0 |
| 0.9756944444444445 | 0 |
| 0.9763888888888889 | 0 |
| 0.9770833333333333 | 0 |
| 0.9777777777777777 | 0 |
| 0.9784722222222223 | 0 |
| 0.9791666666666666 | 0 |
| 0.9798611111111111 | 0 |
| 0.9805555555555556 | 0 |
| 0.9812500000000001 | 0 |
| 0.9819444444444444 | 0 |
| 0.9826388888888888 | 0 |
| 0.9833333333333334 | 0 |
| 0.9840277777777778 | 0 |
| 0.9847222222222222 | 0 |
| 0.9854166666666666 | 0 |
| 0.9861111111111112 | 0 |
| 0.9868055555555556 | 0 |
| 0.9874999999999999 | 0 |
| 0.9881944444444444 | 0 |
| 0.9888888888888889 | 0 |
| 0.9895833333333334 | 0 |
| 0.9902777777777777 | 0 |
| 0.9909722222222223 | 0 |
| 0.9916666666666667 | 0 |
| 0.9923611111111111 | 0 |
| 0.9930555555555555 | 0 |
| 0.99375 | 0 |
| 0.9944444444444445 | 0 |
| 0.9951388888888889 | 0 |
| 0.9958333333333332 | 0 |
| 0.9965277777777778 | 0 |
| 0.9972222222222222 | 0 |
| 0.9979166666666667 | 0 |
| 0.998611111111111 | 0 |
| 0.9993055555555556 | 0 |